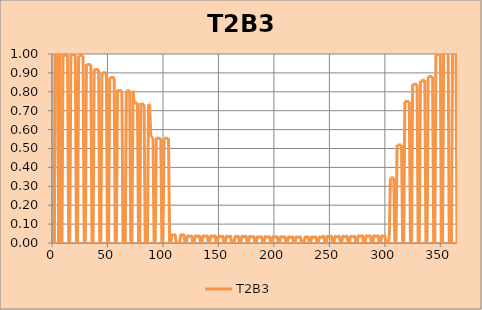
| Category | T2B3 |
|---|---|
| 1.0 | 0 |
| 2.0 | 0 |
| 3.0 | 1.146 |
| 4.0 | 1.146 |
| 5.0 | 1.054 |
| 6.0 | 0 |
| 7.0 | 1.054 |
| 8.0 | 0 |
| 9.0 | 0 |
| 10.0 | 1.054 |
| 11.0 | 1.054 |
| 12.0 | 0.996 |
| 13.0 | 0.996 |
| 14.0 | 0.996 |
| 15.0 | 0 |
| 16.0 | 0 |
| 17.0 | 0.996 |
| 18.0 | 0.996 |
| 19.0 | 0.996 |
| 20.0 | 0.996 |
| 21.0 | 0.996 |
| 22.0 | 0 |
| 23.0 | 0 |
| 24.0 | 0.992 |
| 25.0 | 0.992 |
| 26.0 | 0.992 |
| 27.0 | 0.992 |
| 28.0 | 0.992 |
| 29.0 | 0 |
| 30.0 | 0 |
| 31.0 | 0.946 |
| 32.0 | 0.945 |
| 33.0 | 0.945 |
| 34.0 | 0.945 |
| 35.0 | 0.945 |
| 36.0 | 0 |
| 37.0 | 0 |
| 38.0 | 0.917 |
| 39.0 | 0.917 |
| 40.0 | 0.917 |
| 41.0 | 0.917 |
| 42.0 | 0.917 |
| 43.0 | 0 |
| 44.0 | 0 |
| 45.0 | 0.9 |
| 46.0 | 0.9 |
| 47.0 | 0.9 |
| 48.0 | 0.9 |
| 49.0 | 0.9 |
| 50.0 | 0 |
| 51.0 | 0 |
| 52.0 | 0.875 |
| 53.0 | 0.875 |
| 54.0 | 0.875 |
| 55.0 | 0.875 |
| 56.0 | 0.875 |
| 57.0 | 0 |
| 58.0 | 0 |
| 59.0 | 0.812 |
| 60.0 | 0.806 |
| 61.0 | 0.806 |
| 62.0 | 0.806 |
| 63.0 | 0.806 |
| 64.0 | 0 |
| 65.0 | 0 |
| 66.0 | 0 |
| 67.0 | 0.806 |
| 68.0 | 0.806 |
| 69.0 | 0.806 |
| 70.0 | 0.806 |
| 71.0 | 0 |
| 72.0 | 0 |
| 73.0 | 0.806 |
| 74.0 | 0.741 |
| 75.0 | 0.741 |
| 76.0 | 0.741 |
| 77.0 | 0.741 |
| 78.0 | 0 |
| 79.0 | 0 |
| 80.0 | 0.741 |
| 81.0 | 0.734 |
| 82.0 | 0.734 |
| 83.0 | 0.734 |
| 84.0 | 0 |
| 85.0 | 0 |
| 86.0 | 0 |
| 87.0 | 0.734 |
| 88.0 | 0.734 |
| 89.0 | 0.562 |
| 90.0 | 0.562 |
| 91.0 | 0.557 |
| 92.0 | 0 |
| 93.0 | 0 |
| 94.0 | 0.557 |
| 95.0 | 0.554 |
| 96.0 | 0.554 |
| 97.0 | 0.554 |
| 98.0 | 0.554 |
| 99.0 | 0 |
| 100.0 | 0 |
| 101.0 | 0.554 |
| 102.0 | 0.554 |
| 103.0 | 0.554 |
| 104.0 | 0.554 |
| 105.0 | 0.554 |
| 106.0 | 0 |
| 107.0 | 0 |
| 108.0 | 0.041 |
| 109.0 | 0.041 |
| 110.0 | 0.041 |
| 111.0 | 0.041 |
| 112.0 | 0 |
| 113.0 | 0 |
| 114.0 | 0 |
| 115.0 | 0 |
| 116.0 | 0.041 |
| 117.0 | 0.041 |
| 118.0 | 0.041 |
| 119.0 | 0.041 |
| 120.0 | 0 |
| 121.0 | 0 |
| 122.0 | 0.035 |
| 123.0 | 0.035 |
| 124.0 | 0.035 |
| 125.0 | 0.035 |
| 126.0 | 0.035 |
| 127.0 | 0 |
| 128.0 | 0 |
| 129.0 | 0.035 |
| 130.0 | 0.035 |
| 131.0 | 0.035 |
| 132.0 | 0.035 |
| 133.0 | 0.035 |
| 134.0 | 0 |
| 135.0 | 0 |
| 136.0 | 0.035 |
| 137.0 | 0.035 |
| 138.0 | 0.035 |
| 139.0 | 0.035 |
| 140.0 | 0.035 |
| 141.0 | 0 |
| 142.0 | 0 |
| 143.0 | 0.035 |
| 144.0 | 0.035 |
| 145.0 | 0.035 |
| 146.0 | 0.035 |
| 147.0 | 0.035 |
| 148.0 | 0 |
| 149.0 | 0 |
| 150.0 | 0.035 |
| 151.0 | 0.035 |
| 152.0 | 0.033 |
| 153.0 | 0.033 |
| 154.0 | 0.033 |
| 155.0 | 0 |
| 156.0 | 0 |
| 157.0 | 0.033 |
| 158.0 | 0.033 |
| 159.0 | 0.033 |
| 160.0 | 0.033 |
| 161.0 | 0.033 |
| 162.0 | 0 |
| 163.0 | 0 |
| 164.0 | 0 |
| 165.0 | 0.033 |
| 166.0 | 0.033 |
| 167.0 | 0.033 |
| 168.0 | 0.033 |
| 169.0 | 0 |
| 170.0 | 0 |
| 171.0 | 0.033 |
| 172.0 | 0.033 |
| 173.0 | 0.033 |
| 174.0 | 0.033 |
| 175.0 | 0.033 |
| 176.0 | 0 |
| 177.0 | 0 |
| 178.0 | 0.033 |
| 179.0 | 0.033 |
| 180.0 | 0.033 |
| 181.0 | 0.033 |
| 182.0 | 0.032 |
| 183.0 | 0 |
| 184.0 | 0 |
| 185.0 | 0.032 |
| 186.0 | 0.032 |
| 187.0 | 0.032 |
| 188.0 | 0.032 |
| 189.0 | 0.032 |
| 190.0 | 0 |
| 191.0 | 0 |
| 192.0 | 0.032 |
| 193.0 | 0.032 |
| 194.0 | 0.032 |
| 195.0 | 0.032 |
| 196.0 | 0.032 |
| 197.0 | 0 |
| 198.0 | 0 |
| 199.0 | 0.032 |
| 200.0 | 0.032 |
| 201.0 | 0.032 |
| 202.0 | 0.032 |
| 203.0 | 0.032 |
| 204.0 | 0 |
| 205.0 | 0 |
| 206.0 | 0.032 |
| 207.0 | 0.032 |
| 208.0 | 0.032 |
| 209.0 | 0.032 |
| 210.0 | 0.032 |
| 211.0 | 0 |
| 212.0 | 0 |
| 213.0 | 0.03 |
| 214.0 | 0.03 |
| 215.0 | 0.03 |
| 216.0 | 0.03 |
| 217.0 | 0.03 |
| 218.0 | 0 |
| 219.0 | 0 |
| 220.0 | 0.03 |
| 221.0 | 0.03 |
| 222.0 | 0.03 |
| 223.0 | 0.03 |
| 224.0 | 0.03 |
| 225.0 | 0 |
| 226.0 | 0 |
| 227.0 | 0 |
| 228.0 | 0.03 |
| 229.0 | 0.03 |
| 230.0 | 0.03 |
| 231.0 | 0.03 |
| 232.0 | 0 |
| 233.0 | 0 |
| 234.0 | 0.03 |
| 235.0 | 0.03 |
| 236.0 | 0.03 |
| 237.0 | 0.03 |
| 238.0 | 0.03 |
| 239.0 | 0 |
| 240.0 | 0 |
| 241.0 | 0.03 |
| 242.0 | 0.03 |
| 243.0 | 0.03 |
| 244.0 | 0.033 |
| 245.0 | 0.033 |
| 246.0 | 0 |
| 247.0 | 0 |
| 248.0 | 0.033 |
| 249.0 | 0.033 |
| 250.0 | 0.033 |
| 251.0 | 0.033 |
| 252.0 | 0.033 |
| 253.0 | 0 |
| 254.0 | 0 |
| 255.0 | 0.033 |
| 256.0 | 0.033 |
| 257.0 | 0.033 |
| 258.0 | 0.033 |
| 259.0 | 0.033 |
| 260.0 | 0 |
| 261.0 | 0 |
| 262.0 | 0.033 |
| 263.0 | 0.033 |
| 264.0 | 0.033 |
| 265.0 | 0.033 |
| 266.0 | 0.033 |
| 267.0 | 0 |
| 268.0 | 0 |
| 269.0 | 0.033 |
| 270.0 | 0.033 |
| 271.0 | 0.033 |
| 272.0 | 0.033 |
| 273.0 | 0.033 |
| 274.0 | 0 |
| 275.0 | 0 |
| 276.0 | 0.036 |
| 277.0 | 0.036 |
| 278.0 | 0.036 |
| 279.0 | 0.036 |
| 280.0 | 0.036 |
| 281.0 | 0 |
| 282.0 | 0 |
| 283.0 | 0.036 |
| 284.0 | 0.036 |
| 285.0 | 0.036 |
| 286.0 | 0.036 |
| 287.0 | 0.036 |
| 288.0 | 0 |
| 289.0 | 0 |
| 290.0 | 0.036 |
| 291.0 | 0.036 |
| 292.0 | 0.036 |
| 293.0 | 0.036 |
| 294.0 | 0.036 |
| 295.0 | 0 |
| 296.0 | 0 |
| 297.0 | 0.036 |
| 298.0 | 0.036 |
| 299.0 | 0.036 |
| 300.0 | 0.036 |
| 301.0 | 0 |
| 302.0 | 0 |
| 303.0 | 0 |
| 304.0 | 0.036 |
| 305.0 | 0.345 |
| 306.0 | 0.345 |
| 307.0 | 0.345 |
| 308.0 | 0.345 |
| 309.0 | 0 |
| 310.0 | 0 |
| 311.0 | 0.519 |
| 312.0 | 0.519 |
| 313.0 | 0.519 |
| 314.0 | 0.519 |
| 315.0 | 0.519 |
| 316.0 | 0 |
| 317.0 | 0 |
| 318.0 | 0.749 |
| 319.0 | 0.749 |
| 320.0 | 0.749 |
| 321.0 | 0.749 |
| 322.0 | 0.749 |
| 323.0 | 0 |
| 324.0 | 0 |
| 325.0 | 0.84 |
| 326.0 | 0.84 |
| 327.0 | 0.84 |
| 328.0 | 0.84 |
| 329.0 | 0.84 |
| 330.0 | 0 |
| 331.0 | 0 |
| 332.0 | 0.857 |
| 333.0 | 0.857 |
| 334.0 | 0.857 |
| 335.0 | 0.862 |
| 336.0 | 0.862 |
| 337.0 | 0 |
| 338.0 | 0 |
| 339.0 | 0.88 |
| 340.0 | 0.88 |
| 341.0 | 0.88 |
| 342.0 | 0.88 |
| 343.0 | 0.88 |
| 344.0 | 0 |
| 345.0 | 0 |
| 346.0 | 0.999 |
| 347.0 | 0.999 |
| 348.0 | 0.999 |
| 349.0 | 0.999 |
| 350.0 | 0.999 |
| 351.0 | 0 |
| 352.0 | 0 |
| 353.0 | 1.047 |
| 354.0 | 1.047 |
| 355.0 | 1.047 |
| 356.0 | 1.047 |
| 357.0 | 1.047 |
| 358.0 | 0 |
| 359.0 | 0 |
| 360.0 | 0 |
| 361.0 | 1.047 |
| 362.0 | 1.047 |
| 363.0 | 1.047 |
| 364.0 | 1.142 |
| 365.0 | 0 |